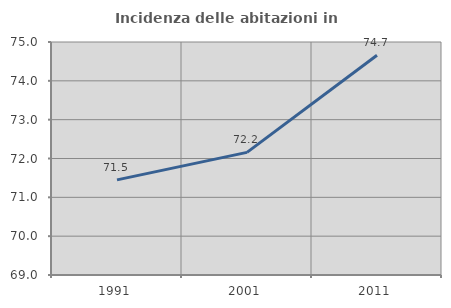
| Category | Incidenza delle abitazioni in proprietà  |
|---|---|
| 1991.0 | 71.45 |
| 2001.0 | 72.158 |
| 2011.0 | 74.659 |